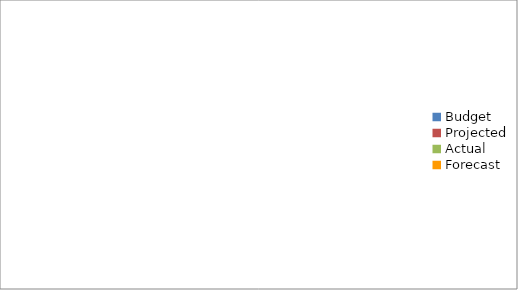
| Category | Series 0 |
|---|---|
| Budget | 3350 |
| Projected | 880 |
| Actual | 2410 |
| Forecast | 1600 |